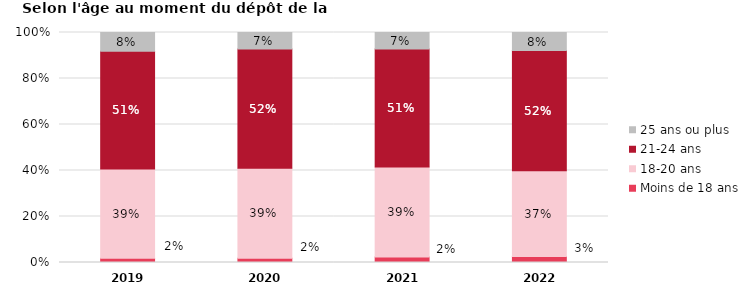
| Category | Moins de 18 ans | 18-20 ans | 21-24 ans | 25 ans ou plus |
|---|---|---|---|---|
| 2019.0 | 0.018 | 0.388 | 0.512 | 0.082 |
| 2020.0 | 0.019 | 0.391 | 0.519 | 0.072 |
| 2021.0 | 0.024 | 0.391 | 0.513 | 0.071 |
| 2022.0 | 0.027 | 0.373 | 0.522 | 0.078 |